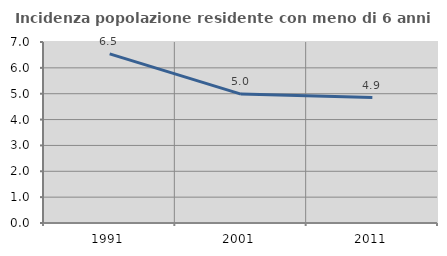
| Category | Incidenza popolazione residente con meno di 6 anni |
|---|---|
| 1991.0 | 6.542 |
| 2001.0 | 4.986 |
| 2011.0 | 4.85 |